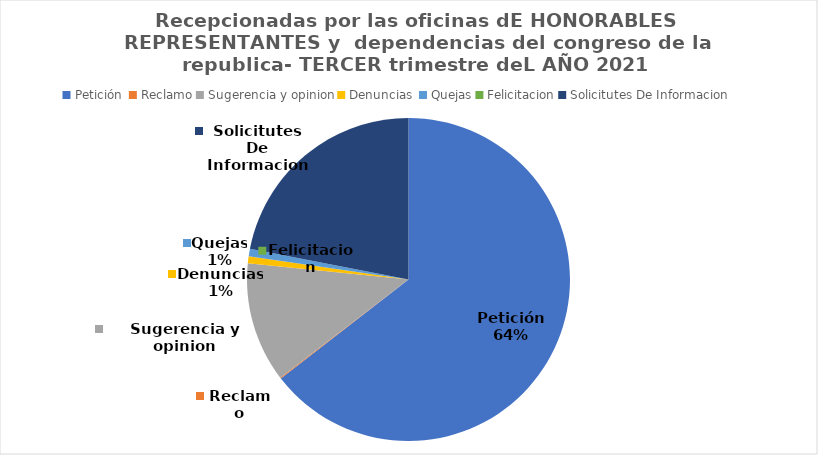
| Category | Series 0 |
|---|---|
| Petición  | 4022 |
| Reclamo | 6 |
| Sugerencia y opinion | 748 |
| Denuncias  | 44 |
| Quejas | 46 |
| Felicitacion | 0 |
| Solicitutes De Informacion | 1369 |